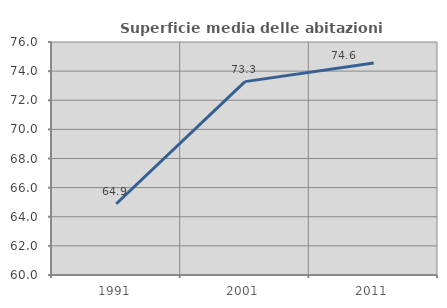
| Category | Superficie media delle abitazioni occupate |
|---|---|
| 1991.0 | 64.891 |
| 2001.0 | 73.28 |
| 2011.0 | 74.552 |